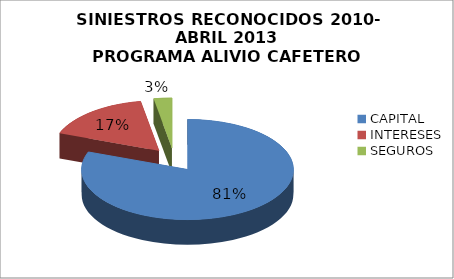
| Category | ALIVIO |
|---|---|
| CAPITAL | 0.807 |
| INTERESES | 0.165 |
| SEGUROS  | 0.028 |